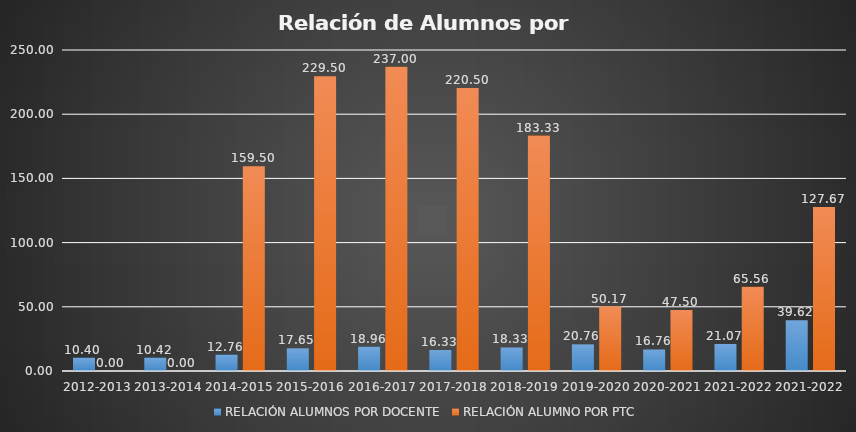
| Category | RELACIÓN ALUMNOS POR DOCENTE | RELACIÓN ALUMNO POR PTC |
|---|---|---|
| 2012-2013 | 10.4 | 0 |
| 2013-2014 | 10.421 | 0 |
| 2014-2015 | 12.76 | 159.5 |
| 2015-2016 | 17.654 | 229.5 |
| 2016-2017 | 18.96 | 237 |
| 2017-2018 | 16.333 | 220.5 |
| 2018-2019 | 18.333 | 183.333 |
| 2019-2020 | 20.759 | 50.167 |
| 2020-2021 | 16.765 | 47.5 |
| 2021-2022 | 21.07 | 65.56 |
| 2021-2022 | 39.62 | 127.67 |